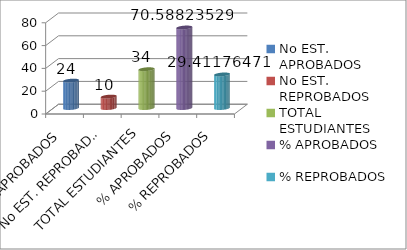
| Category | Series 0 |
|---|---|
| No EST. APROBADOS | 24 |
| No EST. REPROBADOS | 10 |
| TOTAL ESTUDIANTES | 34 |
| % APROBADOS | 70.588 |
| % REPROBADOS | 29.412 |